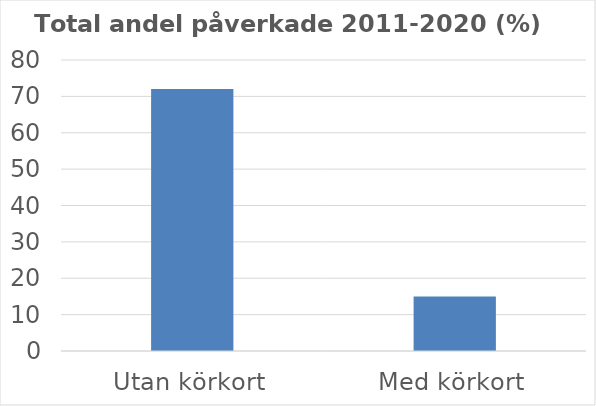
| Category | Andel % |
|---|---|
| Utan körkort | 72 |
| Med körkort | 15 |